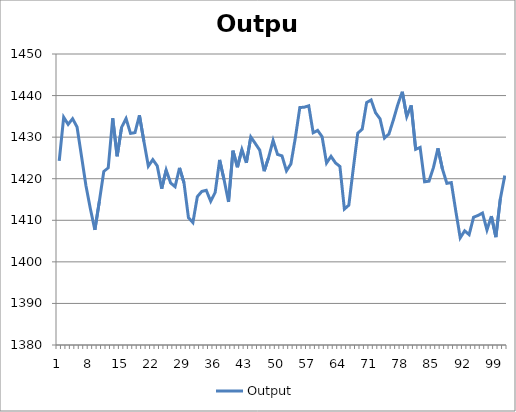
| Category | Output |
|---|---|
| 0 | 1424.272 |
| 1 | 1434.787 |
| 2 | 1433.088 |
| 3 | 1434.45 |
| 4 | 1432.444 |
| 5 | 1425.417 |
| 6 | 1418.294 |
| 7 | 1412.724 |
| 8 | 1407.705 |
| 9 | 1414.509 |
| 10 | 1421.745 |
| 11 | 1422.619 |
| 12 | 1434.54 |
| 13 | 1425.402 |
| 14 | 1432.372 |
| 15 | 1434.468 |
| 16 | 1430.898 |
| 17 | 1431.086 |
| 18 | 1435.247 |
| 19 | 1428.991 |
| 20 | 1423.03 |
| 21 | 1424.592 |
| 22 | 1423.083 |
| 23 | 1417.598 |
| 24 | 1422.085 |
| 25 | 1418.973 |
| 26 | 1418.082 |
| 27 | 1422.611 |
| 28 | 1419.028 |
| 29 | 1410.644 |
| 30 | 1409.457 |
| 31 | 1415.691 |
| 32 | 1416.943 |
| 33 | 1417.214 |
| 34 | 1414.572 |
| 35 | 1416.698 |
| 36 | 1424.519 |
| 37 | 1419.755 |
| 38 | 1414.435 |
| 39 | 1426.729 |
| 40 | 1422.765 |
| 41 | 1427.022 |
| 42 | 1423.812 |
| 43 | 1430.039 |
| 44 | 1428.485 |
| 45 | 1426.861 |
| 46 | 1421.804 |
| 47 | 1425.126 |
| 48 | 1429.21 |
| 49 | 1425.84 |
| 50 | 1425.494 |
| 51 | 1421.899 |
| 52 | 1423.574 |
| 53 | 1429.872 |
| 54 | 1437.117 |
| 55 | 1437.203 |
| 56 | 1437.539 |
| 57 | 1431.056 |
| 58 | 1431.619 |
| 59 | 1430.102 |
| 60 | 1423.775 |
| 61 | 1425.392 |
| 62 | 1423.803 |
| 63 | 1422.948 |
| 64 | 1412.695 |
| 65 | 1413.636 |
| 66 | 1422.45 |
| 67 | 1430.946 |
| 68 | 1431.914 |
| 69 | 1438.328 |
| 70 | 1438.941 |
| 71 | 1435.864 |
| 72 | 1434.414 |
| 73 | 1429.781 |
| 74 | 1430.752 |
| 75 | 1434.151 |
| 76 | 1437.856 |
| 77 | 1440.922 |
| 78 | 1434.953 |
| 79 | 1437.656 |
| 80 | 1427.054 |
| 81 | 1427.528 |
| 82 | 1419.266 |
| 83 | 1419.436 |
| 84 | 1422.727 |
| 85 | 1427.31 |
| 86 | 1422.373 |
| 87 | 1418.89 |
| 88 | 1419.069 |
| 89 | 1412.255 |
| 90 | 1405.784 |
| 91 | 1407.463 |
| 92 | 1406.549 |
| 93 | 1410.738 |
| 94 | 1411.167 |
| 95 | 1411.744 |
| 96 | 1407.665 |
| 97 | 1410.999 |
| 98 | 1405.952 |
| 99 | 1415.142 |
| 100 | 1420.758 |